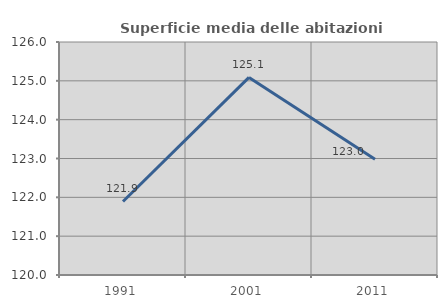
| Category | Superficie media delle abitazioni occupate |
|---|---|
| 1991.0 | 121.893 |
| 2001.0 | 125.088 |
| 2011.0 | 122.982 |